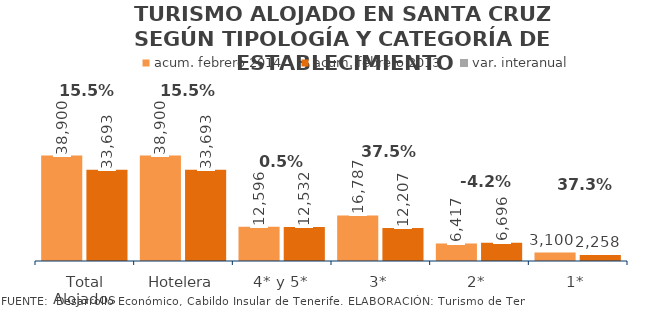
| Category | acum. febrero 2014 | acum. febrero 2013 |
|---|---|---|
| Total Alojados | 38900 | 33693 |
| Hotelera | 38900 | 33693 |
| 4* y 5* | 12596 | 12532 |
| 3* | 16787 | 12207 |
| 2* | 6417 | 6696 |
| 1* | 3100 | 2258 |